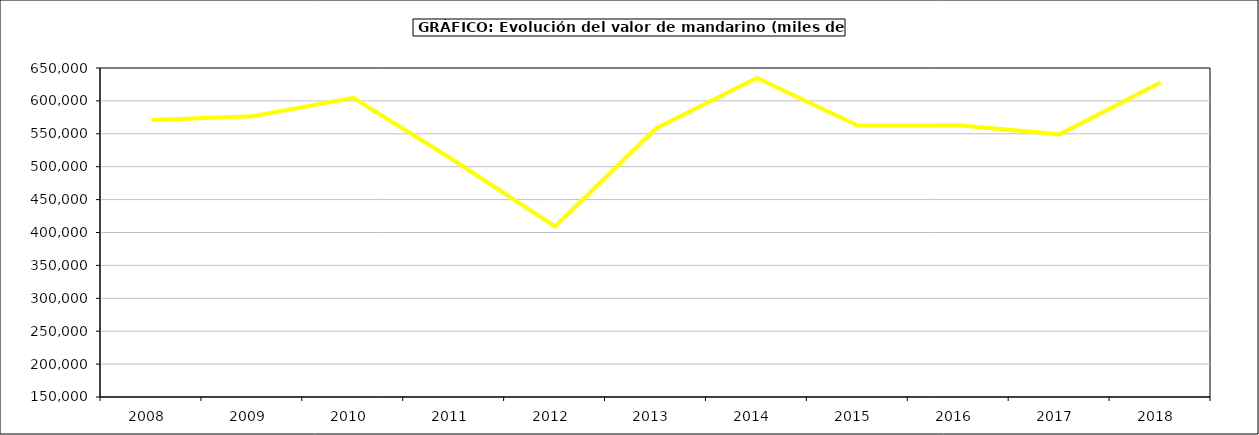
| Category | Valor |
|---|---|
| 2008.0 | 571014.871 |
| 2009.0 | 576642.957 |
| 2010.0 | 604584.128 |
| 2011.0 | 509378.831 |
| 2012.0 | 409245.656 |
| 2013.0 | 558087.419 |
| 2014.0 | 634994.836 |
| 2015.0 | 562627 |
| 2016.0 | 563122 |
| 2017.0 | 549191.426 |
| 2018.0 | 627958.978 |